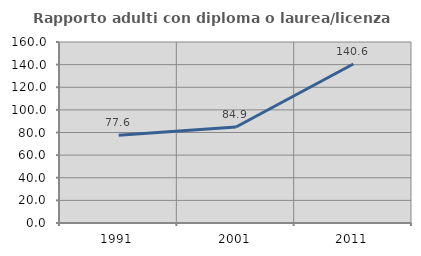
| Category | Rapporto adulti con diploma o laurea/licenza media  |
|---|---|
| 1991.0 | 77.604 |
| 2001.0 | 84.874 |
| 2011.0 | 140.566 |